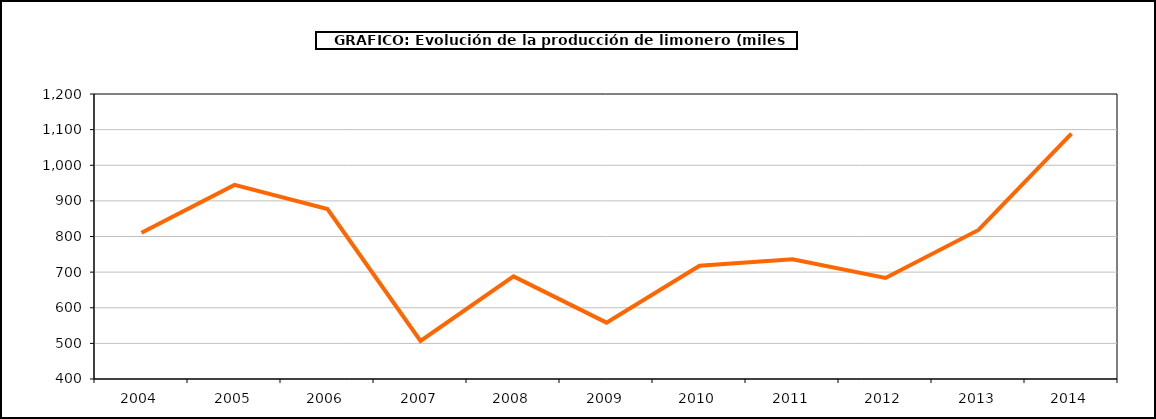
| Category | producción |
|---|---|
| 2004.0 | 810.263 |
| 2005.0 | 944.836 |
| 2006.0 | 877.134 |
| 2007.0 | 506.699 |
| 2008.0 | 687.936 |
| 2009.0 | 558.18 |
| 2010.0 | 717.906 |
| 2011.0 | 736.198 |
| 2012.0 | 683.604 |
| 2013.0 | 818.489 |
| 2014.0 | 1088.964 |